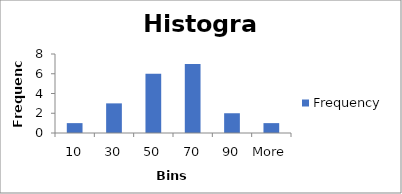
| Category | Frequency |
|---|---|
| 10 | 1 |
| 30 | 3 |
| 50 | 6 |
| 70 | 7 |
| 90 | 2 |
| More | 1 |